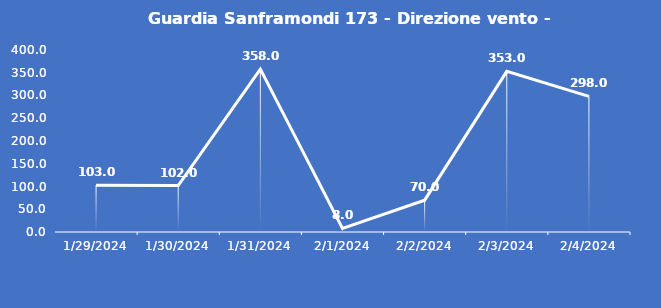
| Category | Guardia Sanframondi 173 - Direzione vento - Grezzo (°N) |
|---|---|
| 1/29/24 | 103 |
| 1/30/24 | 102 |
| 1/31/24 | 358 |
| 2/1/24 | 8 |
| 2/2/24 | 70 |
| 2/3/24 | 353 |
| 2/4/24 | 298 |